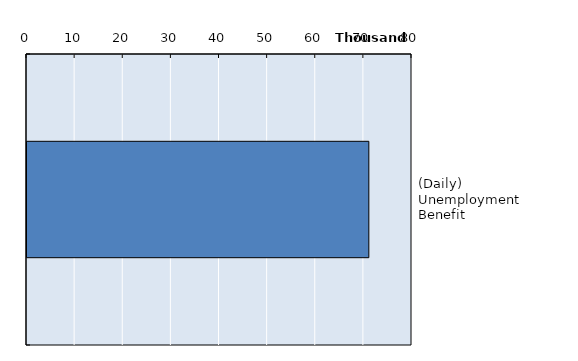
| Category | Series 0 |
|---|---|
| (Daily) Unemployment Benefit | 71032 |